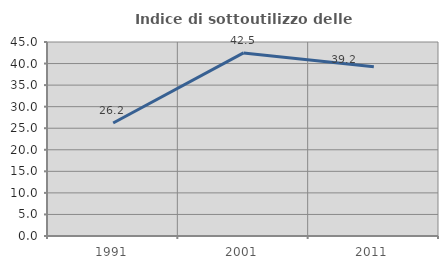
| Category | Indice di sottoutilizzo delle abitazioni  |
|---|---|
| 1991.0 | 26.222 |
| 2001.0 | 42.466 |
| 2011.0 | 39.234 |